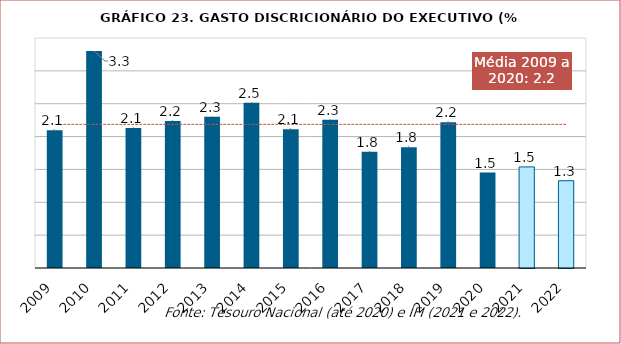
| Category | Discricionárias do Executivo |
|---|---|
| 2009.0 | 2.095 |
| 2010.0 | 3.301 |
| 2011.0 | 2.132 |
| 2012.0 | 2.238 |
| 2013.0 | 2.303 |
| 2014.0 | 2.516 |
| 2015.0 | 2.11 |
| 2016.0 | 2.255 |
| 2017.0 | 1.768 |
| 2018.0 | 1.839 |
| 2019.0 | 2.217 |
| 2020.0 | 1.453 |
| 2021.0 | 1.538 |
| 2022.0 | 1.328 |